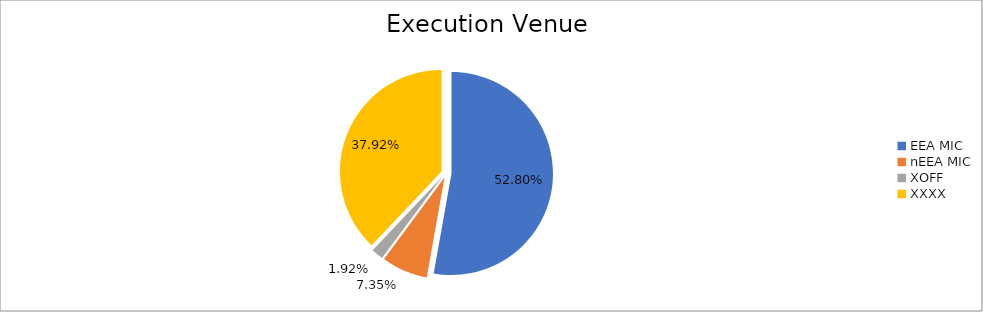
| Category | Series 0 |
|---|---|
| EEA MIC | 7012675.949 |
| nEEA MIC | 976395.047 |
| XOFF | 254992.419 |
| XXXX | 5036473.812 |